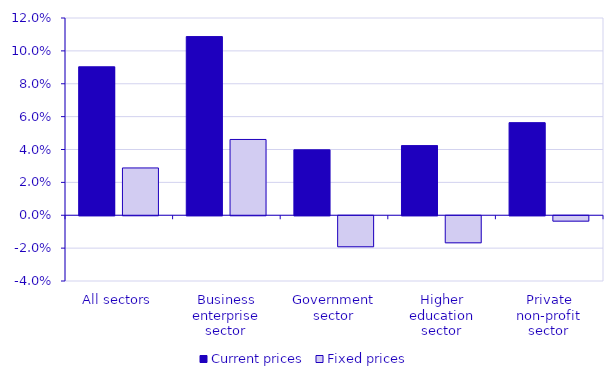
| Category | Current prices | Fixed prices |
|---|---|---|
| All sectors | 0.09 | 0.029 |
| Business enterprise sector | 0.109 | 0.046 |
| Government sector | 0.04 | -0.019 |
| Higher education sector | 0.042 | -0.016 |
| Private non-profit sector | 0.056 | -0.003 |